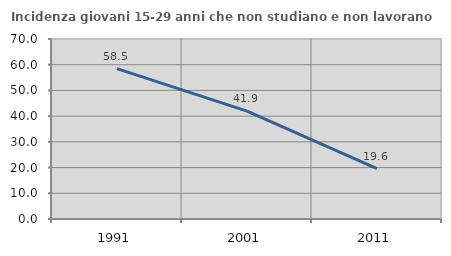
| Category | Incidenza giovani 15-29 anni che non studiano e non lavorano  |
|---|---|
| 1991.0 | 58.452 |
| 2001.0 | 41.935 |
| 2011.0 | 19.626 |